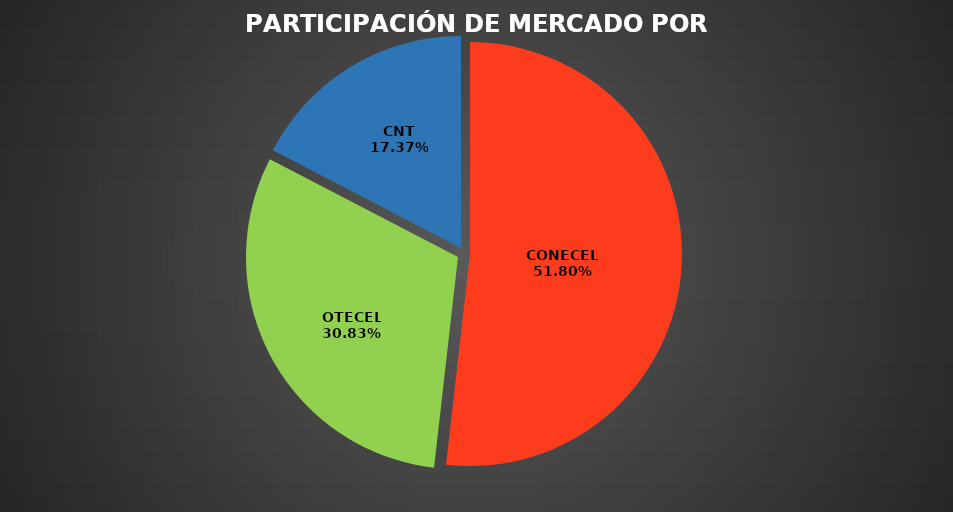
| Category | Feb 2023 |
|---|---|
| CONECEL | 9092490 |
| OTECEL | 5410682 |
| CNT | 3048837 |